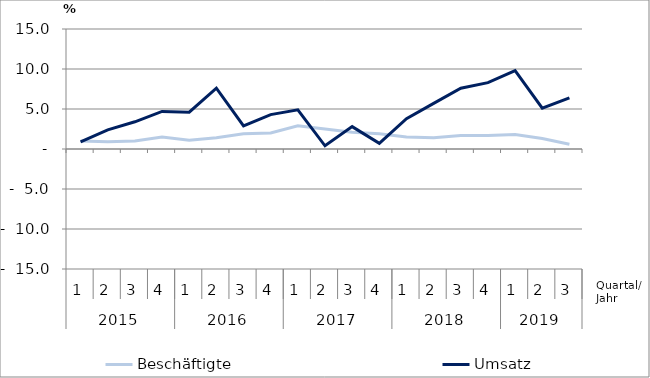
| Category | Beschäftigte | Umsatz |
|---|---|---|
| 0 | 1 | 0.9 |
| 1 | 0.9 | 2.4 |
| 2 | 1 | 3.4 |
| 3 | 1.5 | 4.7 |
| 4 | 1.1 | 4.6 |
| 5 | 1.4 | 7.6 |
| 6 | 1.9 | 2.9 |
| 7 | 2 | 4.3 |
| 8 | 2.9 | 4.9 |
| 9 | 2.5 | 0.4 |
| 10 | 2.1 | 2.8 |
| 11 | 1.9 | 0.7 |
| 12 | 1.5 | 3.8 |
| 13 | 1.4 | 5.7 |
| 14 | 1.7 | 7.6 |
| 15 | 1.7 | 8.3 |
| 16 | 1.8 | 9.8 |
| 17 | 1.3 | 5.1 |
| 18 | 0.6 | 6.4 |